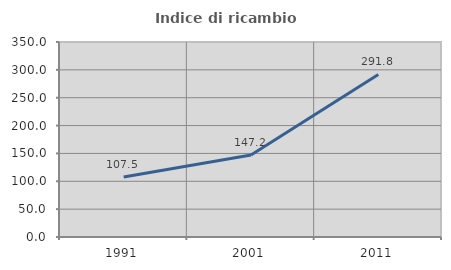
| Category | Indice di ricambio occupazionale  |
|---|---|
| 1991.0 | 107.509 |
| 2001.0 | 147.222 |
| 2011.0 | 291.808 |